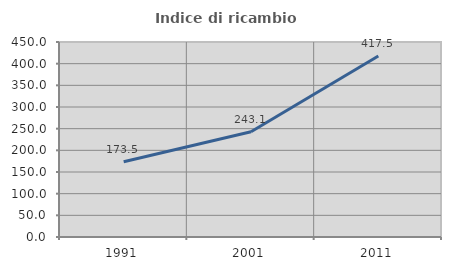
| Category | Indice di ricambio occupazionale  |
|---|---|
| 1991.0 | 173.509 |
| 2001.0 | 243.074 |
| 2011.0 | 417.499 |